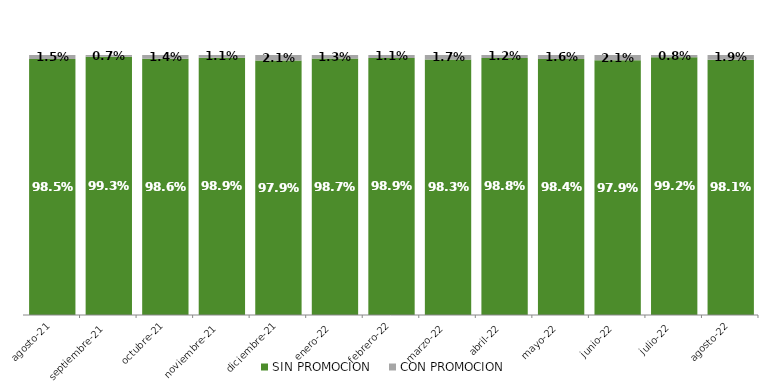
| Category | SIN PROMOCION   | CON PROMOCION   |
|---|---|---|
| 2021-08-01 | 0.985 | 0.015 |
| 2021-09-01 | 0.993 | 0.007 |
| 2021-10-01 | 0.986 | 0.014 |
| 2021-11-01 | 0.989 | 0.011 |
| 2021-12-01 | 0.979 | 0.021 |
| 2022-01-01 | 0.987 | 0.013 |
| 2022-02-01 | 0.989 | 0.011 |
| 2022-03-01 | 0.983 | 0.017 |
| 2022-04-01 | 0.988 | 0.012 |
| 2022-05-01 | 0.984 | 0.016 |
| 2022-06-01 | 0.979 | 0.021 |
| 2022-07-01 | 0.992 | 0.008 |
| 2022-08-01 | 0.981 | 0.019 |